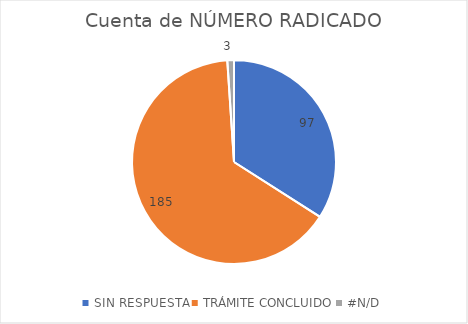
| Category | Cuenta de NÚMERO RADICADO |
|---|---|
| SIN RESPUESTA | 97 |
| TRÁMITE CONCLUIDO | 185 |
| #N/D | 3 |